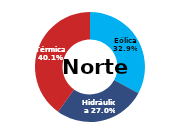
| Category | Norte |
|---|---|
| Eólica | 116.639 |
| Hidráulica | 95.544 |
| Solar | 0 |
| Térmica | 142.255 |